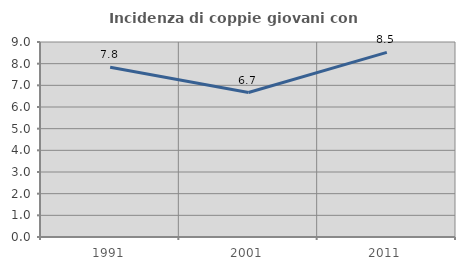
| Category | Incidenza di coppie giovani con figli |
|---|---|
| 1991.0 | 7.834 |
| 2001.0 | 6.667 |
| 2011.0 | 8.52 |